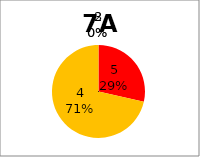
| Category | Series 0 |
|---|---|
| 5.0 | 2 |
| 4.0 | 5 |
| 3.0 | 0 |
| 2.0 | 0 |